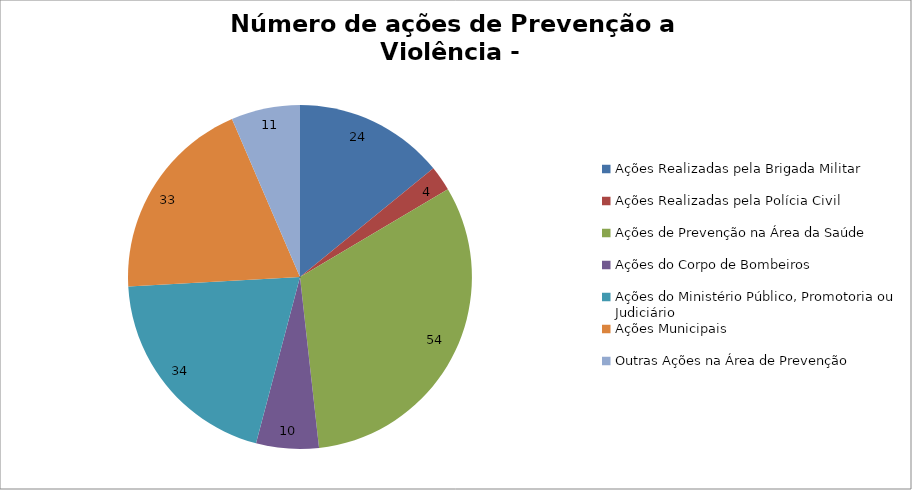
| Category | Número de Ações |
|---|---|
| Ações Realizadas pela Brigada Militar | 24 |
| Ações Realizadas pela Polícia Civil | 4 |
| Ações de Prevenção na Área da Saúde | 54 |
| Ações do Corpo de Bombeiros | 10 |
| Ações do Ministério Público, Promotoria ou Judiciário | 34 |
| Ações Municipais | 33 |
| Outras Ações na Área de Prevenção | 11 |